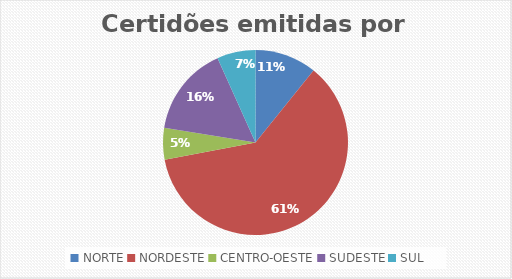
| Category | Series 0 |
|---|---|
| NORTE | 297 |
| NORDESTE | 1685 |
| CENTRO-OESTE | 152 |
| SUDESTE | 433 |
| SUL | 185 |